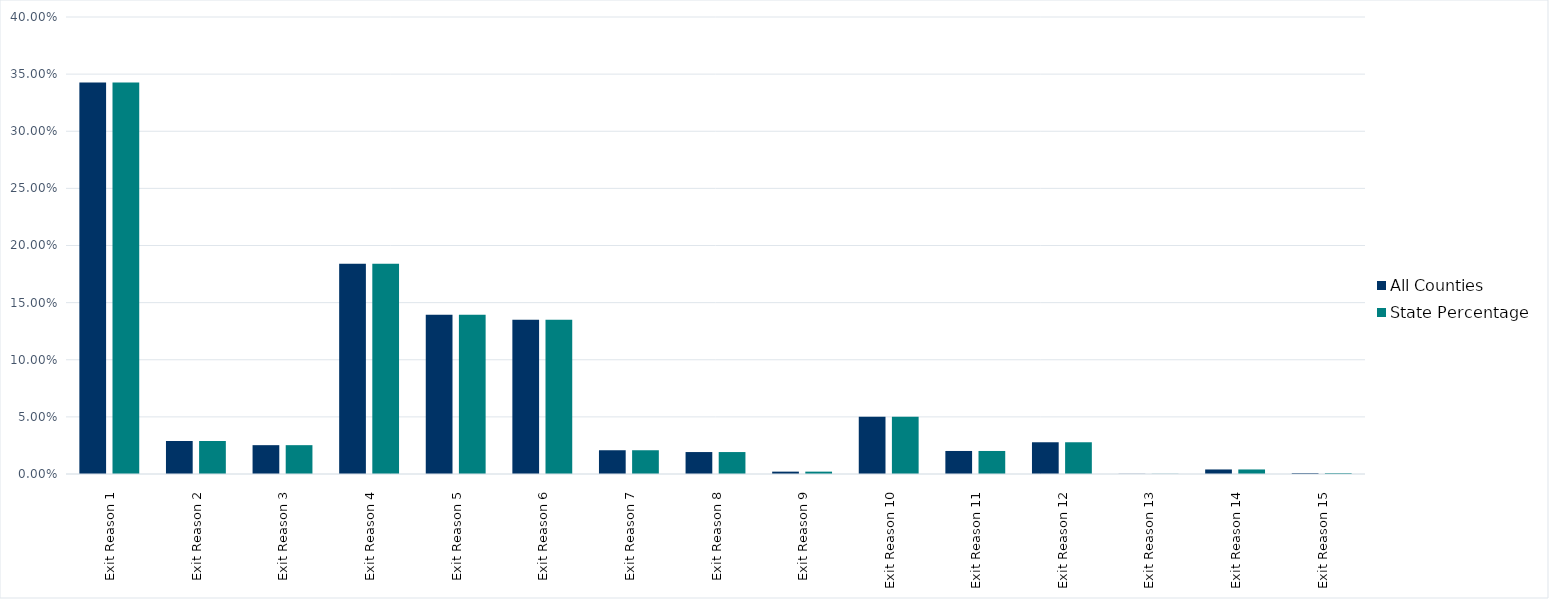
| Category | All Counties | State Percentage |
|---|---|---|
| Exit Reason 1 | 0.343 | 0.343 |
| Exit Reason 2 | 0.029 | 0.029 |
| Exit Reason 3 | 0.025 | 0.025 |
| Exit Reason 4 | 0.184 | 0.184 |
| Exit Reason 5 | 0.139 | 0.139 |
| Exit Reason 6 | 0.135 | 0.135 |
| Exit Reason 7 | 0.021 | 0.021 |
| Exit Reason 8 | 0.019 | 0.019 |
| Exit Reason 9 | 0.002 | 0.002 |
| Exit Reason 10 | 0.05 | 0.05 |
| Exit Reason 11 | 0.02 | 0.02 |
| Exit Reason 12 | 0.028 | 0.028 |
| Exit Reason 13 | 0 | 0 |
| Exit Reason 14 | 0.004 | 0.004 |
| Exit Reason 15 | 0.001 | 0.001 |